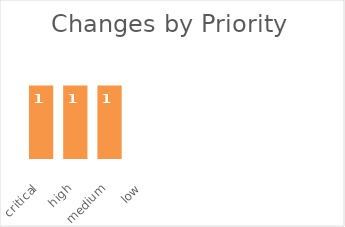
| Category | critical |
|---|---|
| critical | 1 |
| high | 1 |
| medium | 1 |
| low | 0 |